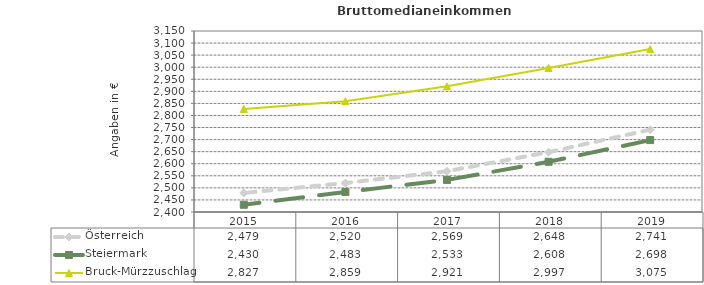
| Category | Österreich | Steiermark | Bruck-Mürzzuschlag |
|---|---|---|---|
| 2019.0 | 2741 | 2698 | 3075 |
| 2018.0 | 2648 | 2608 | 2997 |
| 2017.0 | 2569 | 2533 | 2921 |
| 2016.0 | 2520 | 2483 | 2859 |
| 2015.0 | 2479 | 2430 | 2827 |